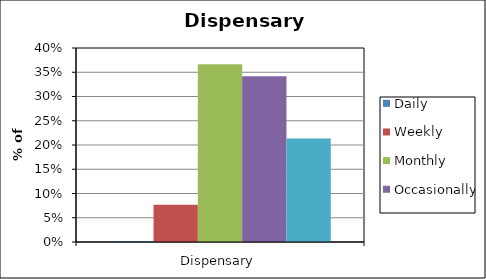
| Category | Daily | Weekly | Monthly | Occasionally | Never |
|---|---|---|---|---|---|
| Dispensary | 0.002 | 0.077 | 0.366 | 0.342 | 0.213 |